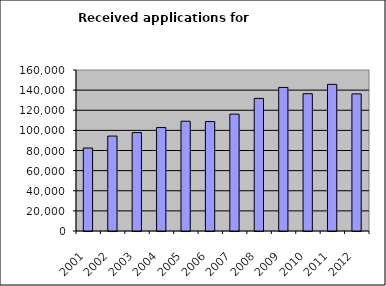
| Category | Series 0 |
|---|---|
| 2001.0 | 82454 |
| 2002.0 | 94358 |
| 2003.0 | 97793 |
| 2004.0 | 102813 |
| 2005.0 | 109089 |
| 2006.0 | 108785 |
| 2007.0 | 116159 |
| 2008.0 | 131779 |
| 2009.0 | 142663 |
| 2010.0 | 136417 |
| 2011.0 | 145734 |
| 2012.0 | 136249 |